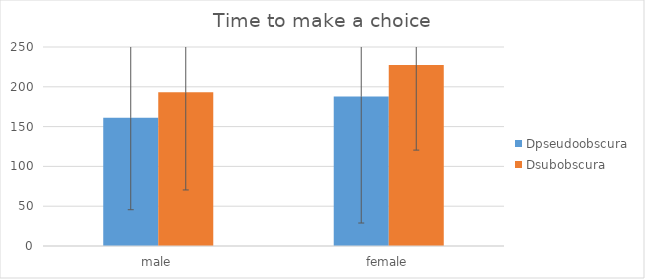
| Category | Dpseudoobscura | Dsubobscura |
|---|---|---|
| male | 160.971 | 193.118 |
| female | 187.737 | 227.25 |